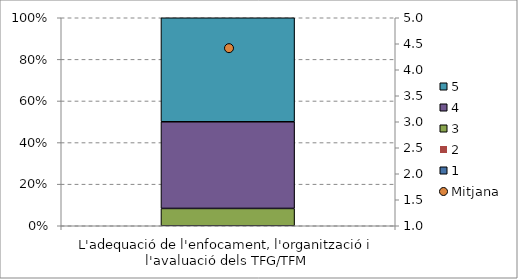
| Category | 1 | 2 | 3 | 4 | 5 |
|---|---|---|---|---|---|
| L'adequació de l'enfocament, l'organització i l'avaluació dels TFG/TFM | 0 | 0 | 0.083 | 0.417 | 0.5 |